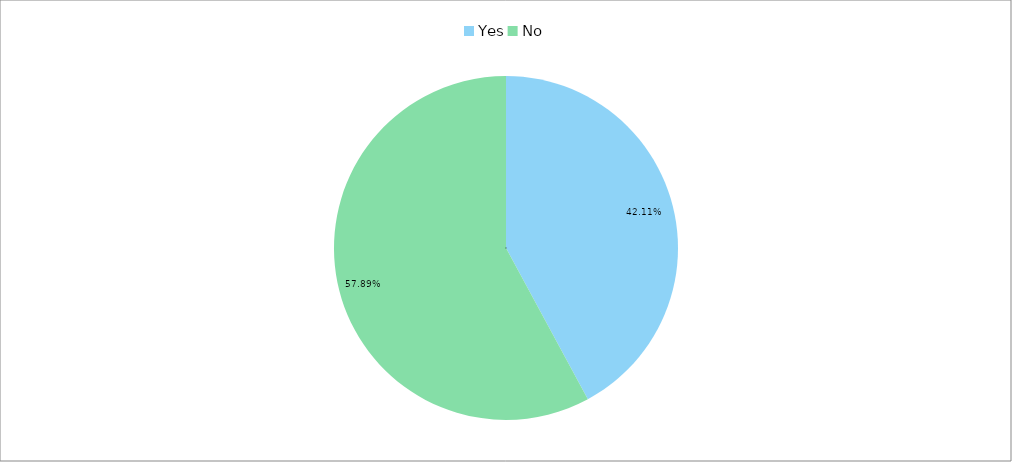
| Category | Total (% & freq col) |
|---|---|
| Yes | 0.421 |
| No | 0.579 |